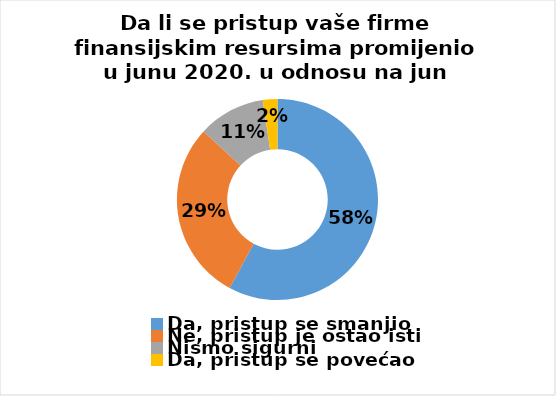
| Category | Series 0 |
|---|---|
| Da, pristup se smanjio | 198 |
| Ne, pristup je ostao isti | 99 |
| Nismo sigurni | 37 |
| Da, pristup se povećao | 8 |